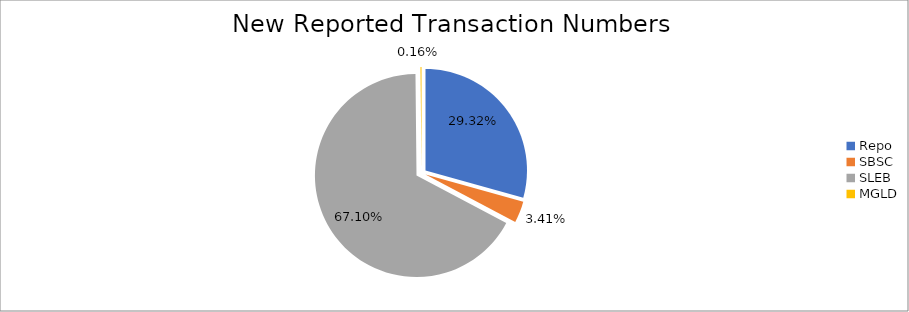
| Category | Series 0 |
|---|---|
| Repo | 373072 |
| SBSC | 43433 |
| SLEB | 853705 |
| MGLD | 2050 |